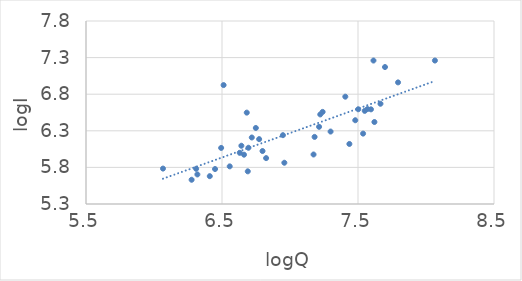
| Category | logQ |
|---|---|
| 7.4798641311650265 | 6.444 |
| 6.2766434893416445 | 5.631 |
| 7.665284718471351 | 6.669 |
| 6.773080375655535 | 6.186 |
| 6.630683385642372 | 5.999 |
| 7.5953872788539725 | 6.593 |
| 6.309918278226516 | 5.781 |
| 7.298445101508147 | 6.29 |
| 6.066108090103747 | 5.784 |
| 7.4067107301776405 | 6.766 |
| 6.71901315438526 | 6.209 |
| 7.213768308118642 | 6.354 |
| 6.947937068614969 | 6.24 |
| 6.493753839851686 | 6.066 |
| 7.222566018822171 | 6.524 |
| 6.9584483932976555 | 5.864 |
| 7.6984827878809465 | 7.171 |
| 6.6895992691789665 | 5.746 |
| 7.569927655242652 | 6.597 |
| 6.79794041297493 | 6.023 |
| 7.436617265234227 | 6.12 |
| 6.694562058521095 | 6.068 |
| 7.549609165154532 | 6.572 |
| 7.1808311990445555 | 6.217 |
| 6.410174881966167 | 5.68 |
| 7.613818684808629 | 7.26 |
| 6.318968113746434 | 5.704 |
| 7.501634457883413 | 6.594 |
| 7.794411205726601 | 6.961 |
| 7.1731917424865985 | 5.976 |
| 6.556778356158042 | 5.814 |
| 6.682108597449809 | 6.548 |
| 6.748759547491679 | 6.339 |
| 7.2399325913204695 | 6.558 |
| 7.620705086838262 | 6.42 |
| 6.824373670043086 | 5.927 |
| 6.511745329644728 | 6.925 |
| 6.661854740545311 | 5.974 |
| 8.065579427282092 | 7.26 |
| 6.448889394146858 | 5.778 |
| 6.642486801367256 | 6.096 |
| 7.537430036586509 | 6.261 |